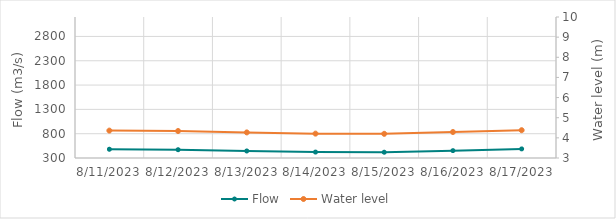
| Category | Flow |
|---|---|
| 5/11/23 | 1852.06 |
| 5/10/23 | 1883.27 |
| 5/9/23 | 1907.49 |
| 5/8/23 | 1788.63 |
| 5/7/23 | 1599.13 |
| 5/6/23 | 1329.98 |
| 5/5/23 | 1250.42 |